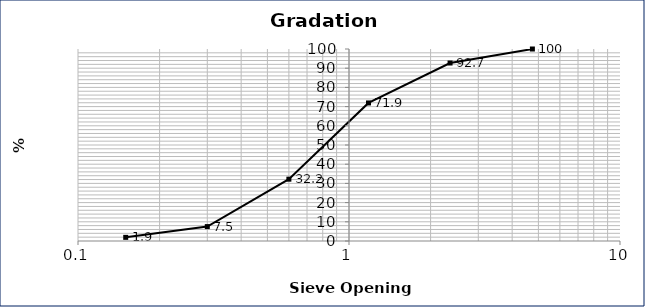
| Category | Series 0 |
|---|---|
| 4.75 | 100 |
| 2.36 | 92.7 |
| 1.18 | 71.9 |
| 0.6 | 32.2 |
| 0.3 | 7.5 |
| 0.15 | 1.9 |